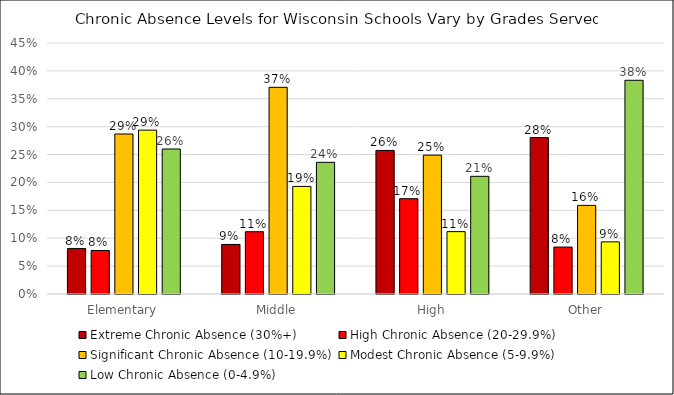
| Category | Extreme Chronic Absence (30%+) | High Chronic Absence (20-29.9%) | Significant Chronic Absence (10-19.9%) | Modest Chronic Absence (5-9.9%) | Low Chronic Absence (0-4.9%) |
|---|---|---|---|---|---|
| Elementary | 0.081 | 0.078 | 0.287 | 0.294 | 0.26 |
| Middle | 0.089 | 0.112 | 0.371 | 0.193 | 0.236 |
| High | 0.257 | 0.171 | 0.249 | 0.112 | 0.211 |
| Other | 0.28 | 0.084 | 0.159 | 0.093 | 0.383 |